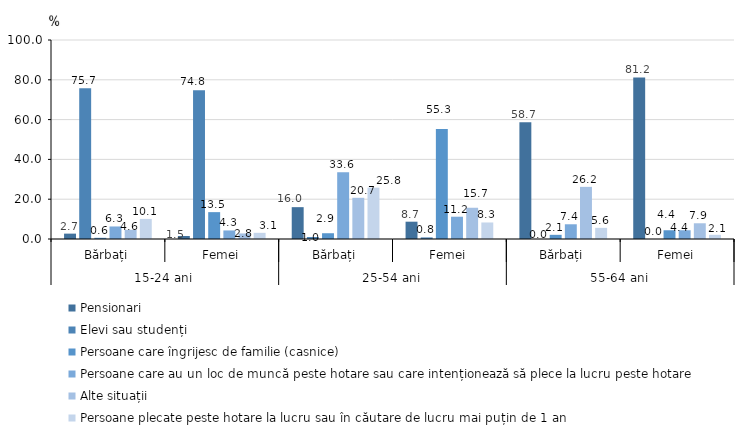
| Category | Pensionari | Elevi sau studenți | Persoane care îngrijesc de familie (casnice) | Persoane care au un loc de muncă peste hotare sau care intenționează să plece la lucru peste hotare | Alte situații | Persoane plecate peste hotare la lucru sau în căutare de lucru mai puțin de 1 an |
|---|---|---|---|---|---|---|
| 0 | 2.7 | 75.7 | 0.6 | 6.3 | 4.6 | 10.1 |
| 1 | 1.5 | 74.8 | 13.5 | 4.3 | 2.8 | 3.1 |
| 2 | 16 | 1 | 2.9 | 33.6 | 20.7 | 25.8 |
| 3 | 8.7 | 0.8 | 55.3 | 11.2 | 15.7 | 8.3 |
| 4 | 58.7 | 0 | 2.1 | 7.4 | 26.2 | 5.6 |
| 5 | 81.2 | 0 | 4.4 | 4.4 | 7.9 | 2.1 |